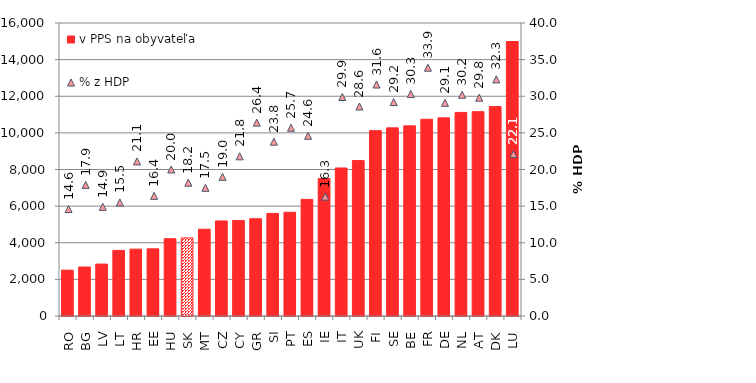
| Category | v PPS na obyvateľa |
|---|---|
| RO | 2504.21 |
| BG | 2675.4 |
| LV | 2834.39 |
| LT | 3581.34 |
| HR | 3650.99 |
| EE | 3665.81 |
| HU | 4222.66 |
| SK | 4265.21 |
| MT | 4736.41 |
| CZ | 5191.11 |
| CY | 5210.68 |
| GR | 5312.96 |
| SI | 5600.78 |
| PT | 5664.99 |
| ES | 6367.82 |
| IE | 7506.21 |
| IT | 8083.01 |
| UK | 8488.19 |
| FI | 10121.72 |
| SE | 10273.09 |
| BE | 10382.3 |
| FR | 10742.43 |
| DE | 10819.74 |
| NL | 11117.67 |
| AT | 11159.15 |
| DK | 11436.18 |
| LU | 14988.66 |